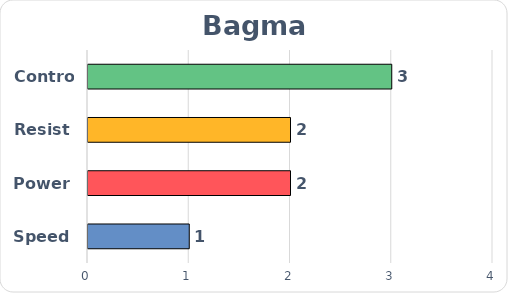
| Category | Series 0 |
|---|---|
| Speed | 1 |
| Power | 2 |
| Resist | 2 |
| Control | 3 |